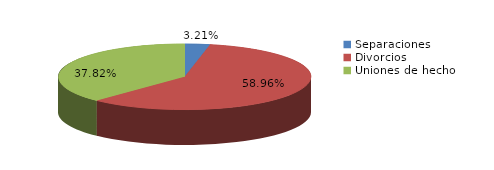
| Category | Series 0 |
|---|---|
| Separaciones | 62 |
| Divorcios | 1138 |
| Uniones de hecho | 730 |